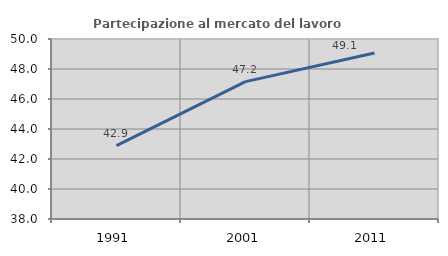
| Category | Partecipazione al mercato del lavoro  femminile |
|---|---|
| 1991.0 | 42.887 |
| 2001.0 | 47.159 |
| 2011.0 | 49.07 |